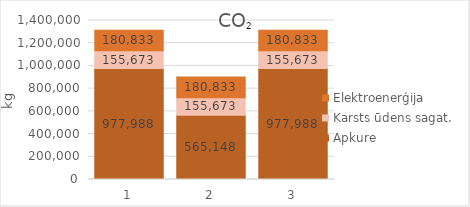
| Category | Apkure | Karsts ūdens sagat. | Elektroenerģija |
|---|---|---|---|
| 1.0 | 977987.783 | 155673.32 | 180833.267 |
| 2.0 | 565147.52 | 155673.32 | 180833.267 |
| 3.0 | 977987.783 | 155673.32 | 180833.267 |